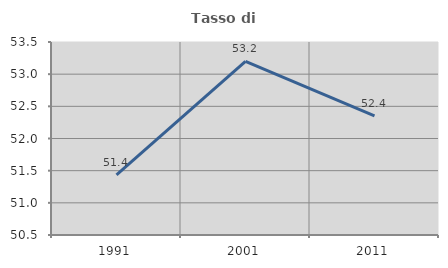
| Category | Tasso di occupazione   |
|---|---|
| 1991.0 | 51.435 |
| 2001.0 | 53.198 |
| 2011.0 | 52.353 |